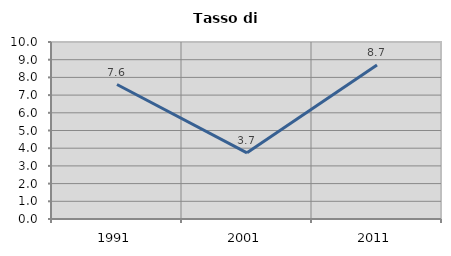
| Category | Tasso di disoccupazione   |
|---|---|
| 1991.0 | 7.597 |
| 2001.0 | 3.738 |
| 2011.0 | 8.696 |